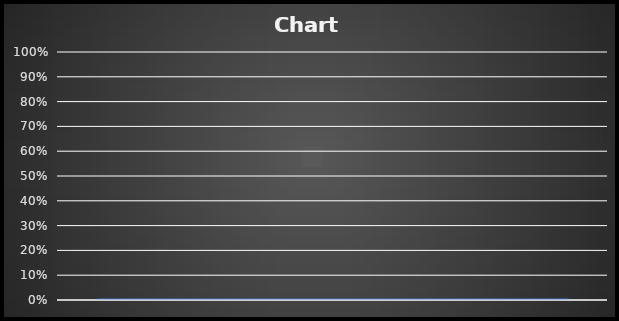
| Category | Sleep Efficiency for Week 1 | Goal |
|---|---|---|
|  | 0 |  |
|  | 0 |  |
|  | 0 |  |
|  | 0 |  |
|  | 0 |  |
|  | 0 |  |
|  | 0 |  |